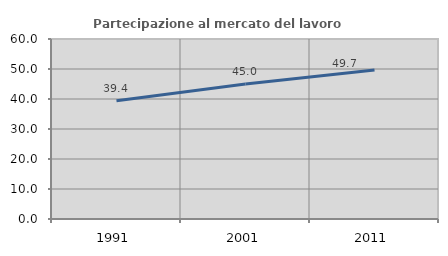
| Category | Partecipazione al mercato del lavoro  femminile |
|---|---|
| 1991.0 | 39.427 |
| 2001.0 | 44.969 |
| 2011.0 | 49.658 |